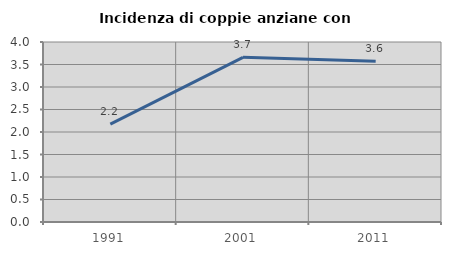
| Category | Incidenza di coppie anziane con figli |
|---|---|
| 1991.0 | 2.174 |
| 2001.0 | 3.659 |
| 2011.0 | 3.571 |